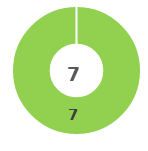
| Category | Series 0 |
|---|---|
| 0 | 0 |
| 1 | 7 |
| 2 | 0 |
| 3 | 0 |
| 4 | 0 |